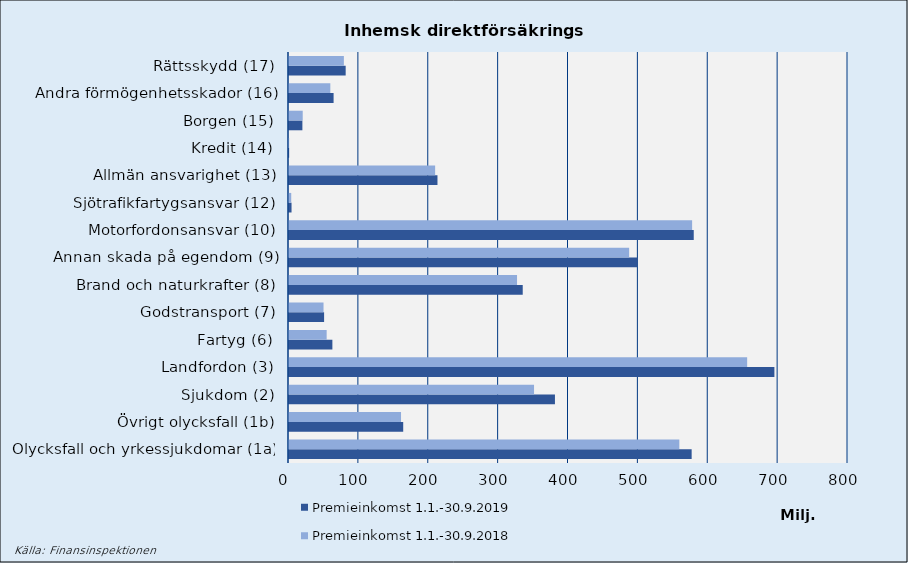
| Category | Premieinkomst |
|---|---|
| Olycksfall och yrkessjukdomar (1a) | 558601.51 |
| Övrigt olycksfall (1b) | 160328.9 |
| Sjukdom (2) | 350676.629 |
| Landfordon (3) | 655678.022 |
| Fartyg (6) | 53892.415 |
| Godstransport (7) | 49415.574 |
| Brand och naturkrafter (8) | 326355.779 |
| Annan skada på egendom (9) | 486800.296 |
| Motorfordonsansvar (10) | 576912.132 |
| Sjötrafikfartygsansvar (12) | 3191.632 |
| Allmän ansvarighet (13) | 209136.091 |
| Kredit (14) | 203.124 |
| Borgen (15) | 19627.085 |
| Andra förmögenhetsskador (16) | 59141.14 |
| Rättsskydd (17) | 78524.75 |